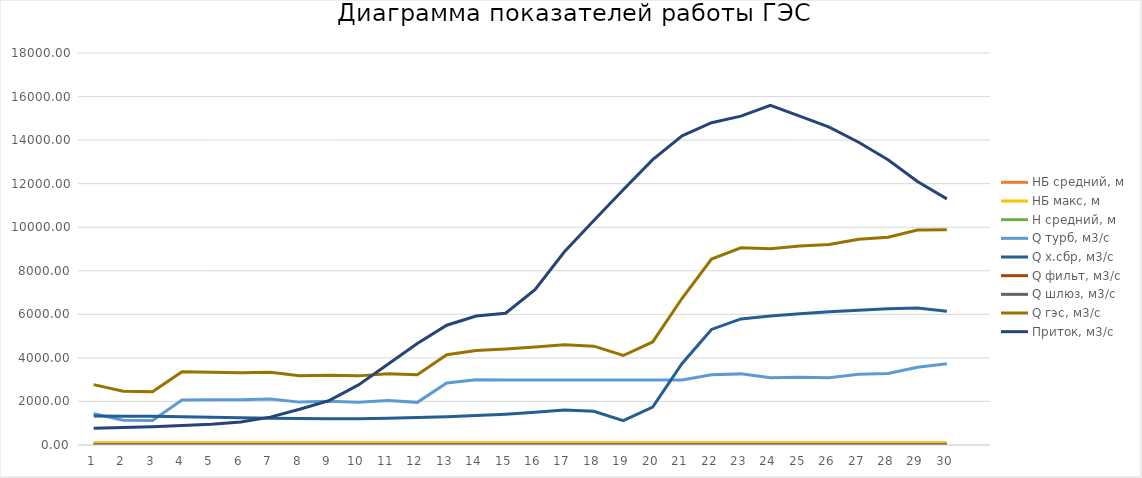
| Category | НБ средний, м | ВБ средний, м
 | НБ макс, м | НБ мин, м | Н средний, м | Q турб, м3/c | Q х.сбр, м3/c | Q фильт, м3/c | Q шлюз, м3/c | Q гэс, м3/c | Приток, м3/с |
|---|---|---|---|---|---|---|---|---|---|---|---|
| 1 | 87.568 |  | 88.431 |  | 14.937 | 1432.99 | 1335.867 | 3 | 0 | 2771.858 | 767 |
| 2 | 87.108 |  | 87.772 |  | 15.403 | 1141.063 | 1325.595 | 3 | 0 | 2469.657 | 804 |
| 3 | 86.996 |  | 87.62 |  | 15.486 | 1123.535 | 1318.452 | 3 | 0 | 2444.988 | 842 |
| 4 | 87.668 |  | 88.583 |  | 14.656 | 2069.833 | 1293.889 | 3 | 0 | 3366.722 | 893 |
| 5 | 87.909 |  | 88.596 |  | 14.39 | 2072.767 | 1270.498 | 3 | 0 | 3346.265 | 952 |
| 6 | 87.983 |  | 88.518 |  | 14.201 | 2073.593 | 1246.377 | 3 | 0 | 3322.97 | 1060 |
| 7 | 88.161 |  | 88.705 |  | 13.94 | 2110.899 | 1225.424 | 3 | 0 | 3339.323 | 1280 |
| 8 | 87.919 |  | 88.64 |  | 14.18 | 1968.991 | 1213.078 | 3 | 0 | 3185.07 | 1640 |
| 9 | 87.952 |  | 88.214 |  | 14.073 | 2004.674 | 1200.514 | 3 | 0 | 3208.188 | 2040 |
| 10 | 87.835 |  | 88.062 |  | 14.178 | 1961.226 | 1209.966 | 3 | 0 | 3174.192 | 2760 |
| 11 | 88.007 |  | 88.57 |  | 13.995 | 2039.801 | 1228.617 | 3 | 0 | 3271.418 | 3710 |
| 12 | 87.839 |  | 88.401 |  | 14.369 | 1957.981 | 1266.691 | 3 | 0 | 3227.672 | 4660 |
| 13 | 88.432 |  | 88.627 |  | 13.853 | 2845.753 | 1299.417 | 3 | 0 | 4148.17 | 5500 |
| 14 | 88.692 |  | 88.726 |  | 13.776 | 2990.897 | 1349.008 | 3 | 0 | 4342.905 | 5920 |
| 15 | 88.708 |  | 88.722 |  | 14.008 | 2988.517 | 1415.549 | 3 | 0 | 4407.066 | 6050 |
| 16 | 88.462 |  | 88.748 |  | 14.577 | 2988.517 | 1505.721 | 3 | 0 | 4497.238 | 7130 |
| 17 | 88.355 |  | 88.627 |  | 15.181 | 2988.517 | 1610.396 | 3 | 0 | 4601.913 | 8870 |
| 18 | 88.585 |  | 88.627 |  | 15.42 | 2988.517 | 1548.352 | 3 | 0 | 4539.869 | 10310 |
| 19 | 88.883 |  | 89.321 |  | 15.571 | 2988.517 | 1117.963 | 3 | 0 | 4109.481 | 11720 |
| 20 | 89.712 |  | 90.232 |  | 15.264 | 2988.517 | 1740.756 | 3 | 0 | 4732.273 | 13100 |
| 21 | 91.053 |  | 91.895 |  | 14.385 | 2988.517 | 3746.424 | 3 | 0 | 6737.942 | 14200 |
| 22 | 92.188 |  | 92.589 |  | 13.68 | 3225.734 | 5307.696 | 3 | 0 | 8536.43 | 14800 |
| 23 | 92.624 |  | 92.711 |  | 13.608 | 3265.888 | 5788.625 | 3 | 0 | 9057.513 | 15100 |
| 24 | 92.732 |  | 92.793 |  | 13.823 | 3093.224 | 5919.656 | 3 | 0 | 9015.88 | 15600 |
| 25 | 92.852 |  | 92.923 |  | 13.987 | 3113.619 | 6024.947 | 3 | 0 | 9141.566 | 15100 |
| 26 | 92.911 |  | 92.954 |  | 14.229 | 3087.597 | 6118.618 | 3 | 0 | 9209.215 | 14600 |
| 27 | 93 |  | 93.058 |  | 14.289 | 3253.492 | 6191.742 | 3 | 0 | 9448.234 | 13900 |
| 28 | 93.095 |  | 93.154 |  | 14.323 | 3279.395 | 6256.813 | 3 | 0 | 9539.208 | 13100 |
| 29 | 93.205 |  | 93.262 |  | 14.276 | 3570.209 | 6295.933 | 3 | 0 | 9869.141 | 12100 |
| 30 | 93.28 |  | 93.344 |  | 14.231 | 3734.056 | 6144.315 | 3 | 0 | 9881.371 | 11300 |